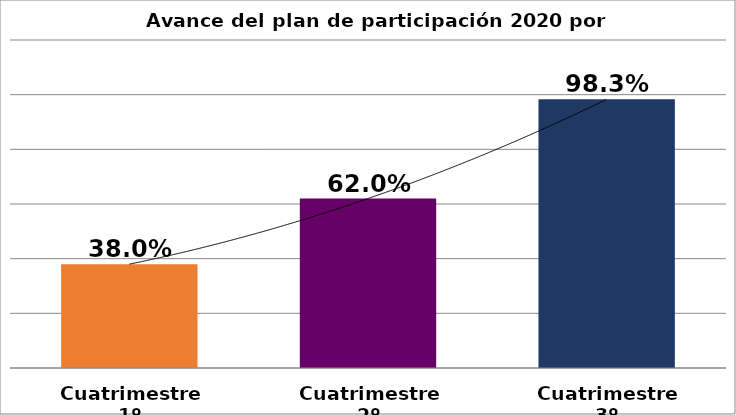
| Category | Avnace por perioros |
|---|---|
| Cuatrimestre 1º | 0.38 |
| Cuatrimestre 2º | 0.62 |
| Cuatrimestre 3º | 0.983 |